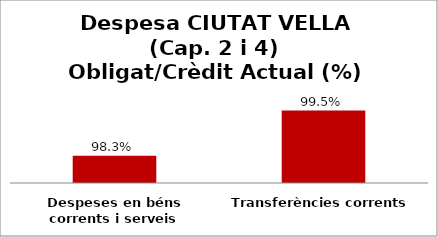
| Category | Series 0 |
|---|---|
| Despeses en béns corrents i serveis | 0.983 |
| Transferències corrents | 0.995 |